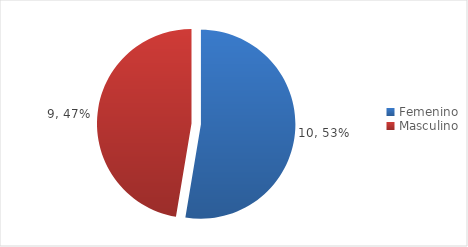
| Category | Series 0 |
|---|---|
| Femenino | 10 |
| Masculino | 9 |